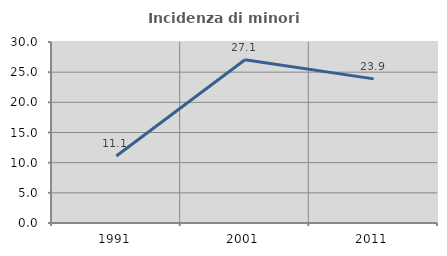
| Category | Incidenza di minori stranieri |
|---|---|
| 1991.0 | 11.111 |
| 2001.0 | 27.059 |
| 2011.0 | 23.887 |